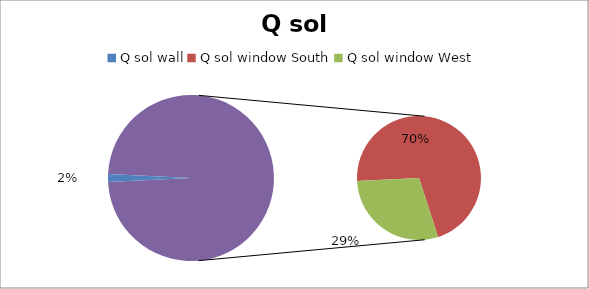
| Category | Series 0 |
|---|---|
| 0 | 27.736 |
| 1 | 1271.857 |
| 2 | 525.111 |